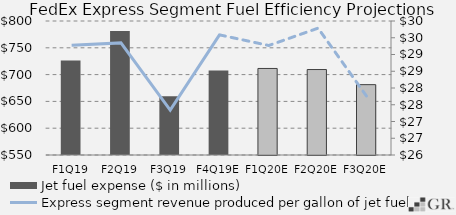
| Category | Jet fuel expense ($ in millions) |
|---|---|
|  F1Q19  | 726.404 |
|  F2Q19  | 781.141 |
|  F3Q19  | 659.784 |
|  F4Q19E  | 707.777 |
|  F1Q20E  | 711.461 |
|  F2Q20E  | 709.441 |
|  F3Q20E  | 681.246 |